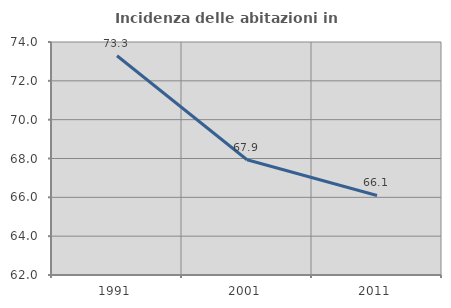
| Category | Incidenza delle abitazioni in proprietà  |
|---|---|
| 1991.0 | 73.291 |
| 2001.0 | 67.934 |
| 2011.0 | 66.097 |